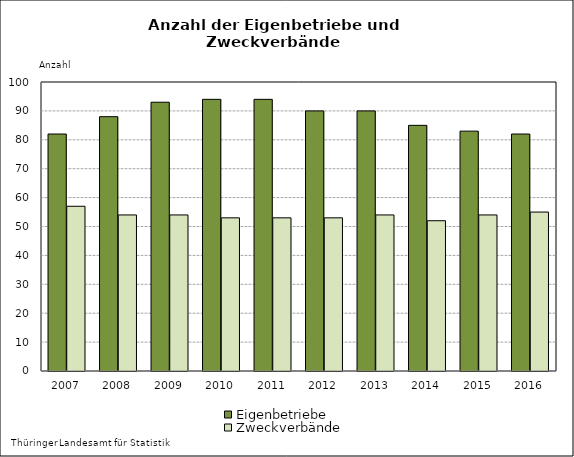
| Category | Eigenbetriebe | Zweckverbände |
|---|---|---|
| 2007.0 | 82 | 57 |
| 2008.0 | 88 | 54 |
| 2009.0 | 93 | 54 |
| 2010.0 | 94 | 53 |
| 2011.0 | 94 | 53 |
| 2012.0 | 90 | 53 |
| 2013.0 | 90 | 54 |
| 2014.0 | 85 | 52 |
| 2015.0 | 83 | 54 |
| 2016.0 | 82 | 55 |